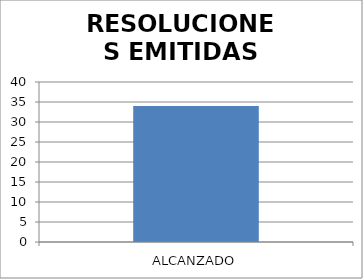
| Category | RESOLUCIONES EMITIDAS DSR |
|---|---|
| ALCANZADO | 34 |